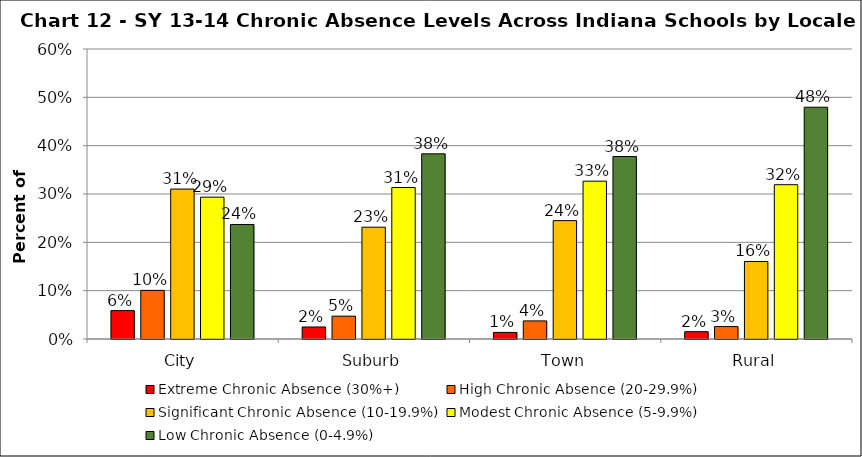
| Category | Extreme Chronic Absence (30%+) | High Chronic Absence (20-29.9%) | Significant Chronic Absence (10-19.9%) | Modest Chronic Absence (5-9.9%) | Low Chronic Absence (0-4.9%) |
|---|---|---|---|---|---|
| 0 | 0.059 | 0.101 | 0.31 | 0.294 | 0.237 |
| 1 | 0.025 | 0.047 | 0.231 | 0.313 | 0.383 |
| 2 | 0.014 | 0.037 | 0.245 | 0.327 | 0.378 |
| 3 | 0.015 | 0.026 | 0.16 | 0.319 | 0.48 |